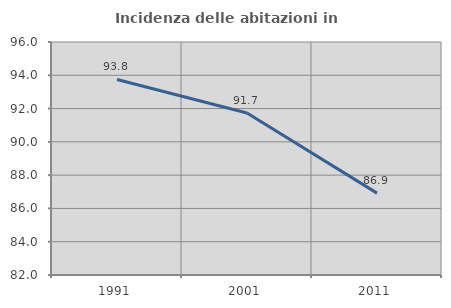
| Category | Incidenza delle abitazioni in proprietà  |
|---|---|
| 1991.0 | 93.75 |
| 2001.0 | 91.729 |
| 2011.0 | 86.919 |